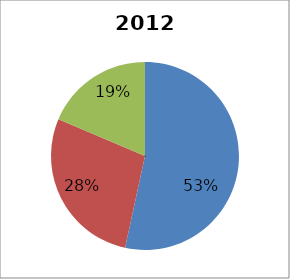
| Category | 2012 Breakdown |
|---|---|
| 0 | 0.534 |
| 1 | 0.28 |
| 2 | 0.186 |